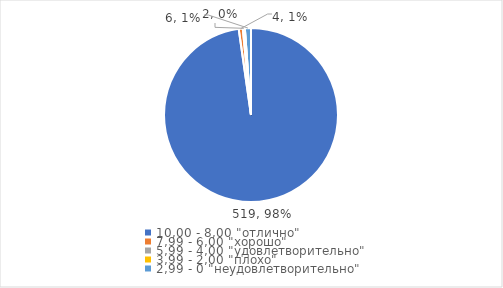
| Category | Series 0 | Series 1 |
|---|---|---|
| 10,00 - 8,00 "отлично" | 519 | 0.977 |
| 7,99 - 6,00 "хорошо" | 4 | 0.008 |
| 5,99 - 4,00 "удовлетворительно" | 2 | 0.004 |
| 3,99 - 2,00 "плохо" | 0 | 0 |
| 2,99 - 0 "неудовлетворительно" | 6 | 0.011 |